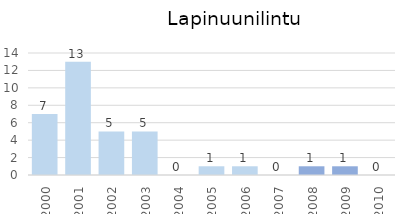
| Category | Series 0 |
|---|---|
| 2000.0 | 7 |
| 2001.0 | 13 |
| 2002.0 | 5 |
| 2003.0 | 5 |
| 2004.0 | 0 |
| 2005.0 | 1 |
| 2006.0 | 1 |
| 2007.0 | 0 |
| 2008.0 | 1 |
| 2009.0 | 1 |
| 2010.0 | 0 |